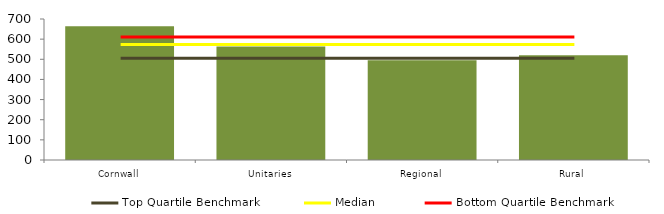
| Category | Block Data |
|---|---|
| Cornwall | 663.4 |
| Unitaries | 563.505 |
| Regional | 495.136 |
|  Rural  | 519.537 |